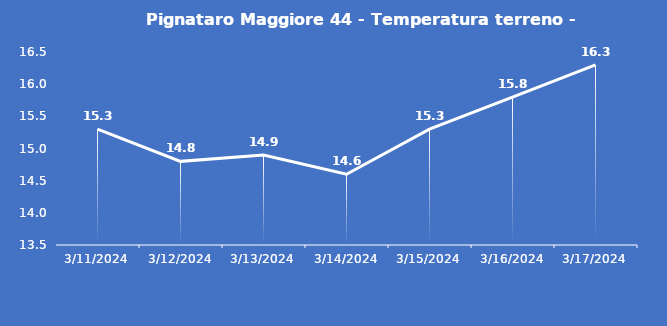
| Category | Pignataro Maggiore 44 - Temperatura terreno - Grezzo (°C) |
|---|---|
| 3/11/24 | 15.3 |
| 3/12/24 | 14.8 |
| 3/13/24 | 14.9 |
| 3/14/24 | 14.6 |
| 3/15/24 | 15.3 |
| 3/16/24 | 15.8 |
| 3/17/24 | 16.3 |